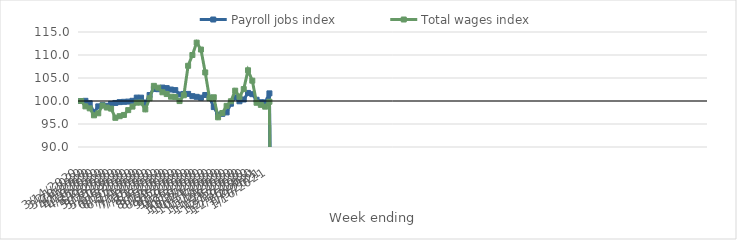
| Category | Payroll jobs index | Total wages index |
|---|---|---|
| 14/03/2020 | 100 | 100 |
| 21/03/2020 | 100.039 | 98.83 |
| 28/03/2020 | 99.51 | 98.402 |
| 04/04/2020 | 97.492 | 96.888 |
| 11/04/2020 | 98.832 | 97.324 |
| 18/04/2020 | 99.097 | 99.021 |
| 25/04/2020 | 98.954 | 98.58 |
| 02/05/2020 | 99.38 | 98.344 |
| 09/05/2020 | 99.575 | 96.348 |
| 16/05/2020 | 99.761 | 96.698 |
| 23/05/2020 | 99.822 | 96.965 |
| 30/05/2020 | 99.869 | 98.018 |
| 06/06/2020 | 100.042 | 98.782 |
| 13/06/2020 | 100.739 | 99.642 |
| 20/06/2020 | 100.727 | 99.67 |
| 27/06/2020 | 99.587 | 98.176 |
| 04/07/2020 | 101.301 | 100.592 |
| 11/07/2020 | 102.622 | 103.294 |
| 18/07/2020 | 102.564 | 102.895 |
| 25/07/2020 | 102.918 | 101.895 |
| 01/08/2020 | 102.801 | 101.511 |
| 08/08/2020 | 102.492 | 100.934 |
| 15/08/2020 | 102.371 | 100.88 |
| 22/08/2020 | 101.424 | 99.984 |
| 29/08/2020 | 101.532 | 101.25 |
| 05/09/2020 | 101.544 | 107.654 |
| 12/09/2020 | 101.052 | 109.999 |
| 19/09/2020 | 100.905 | 112.688 |
| 26/09/2020 | 100.725 | 111.187 |
| 03/10/2020 | 101.305 | 106.207 |
| 10/10/2020 | 100.725 | 100.608 |
| 17/10/2020 | 98.682 | 100.811 |
| 24/10/2020 | 97.02 | 96.451 |
| 31/10/2020 | 97.211 | 97.391 |
| 07/11/2020 | 97.523 | 98.942 |
| 14/11/2020 | 99.404 | 99.942 |
| 21/11/2020 | 100.795 | 102.248 |
| 28/11/2020 | 99.939 | 100.913 |
| 05/12/2020 | 100.324 | 102.59 |
| 12/12/2020 | 101.756 | 106.678 |
| 19/12/2020 | 101.482 | 104.42 |
| 26/12/2020 | 100.271 | 99.62 |
| 02/01/2021 | 99.736 | 99.161 |
| 09/01/2021 | 99.699 | 98.769 |
| 16/01/2021 | 101.661 | 99.84 |